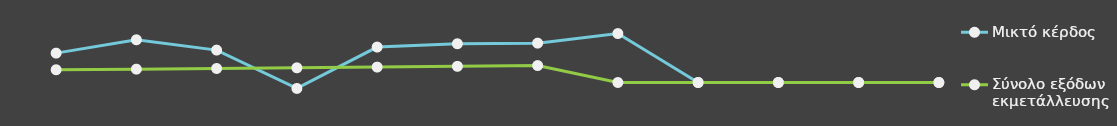
| Category | Μικτό κέρδος | Σύνολο εξόδων εκμετάλλευσης |
|---|---|---|
| 0 | 25000 | 10841 |
| 1 | 36348 | 11367.25 |
| 2 | 27562 | 11919.82 |
| 3 | -5059.5 | 12500.01 |
| 4 | 30153.18 | 13109.21 |
| 5 | 32964.45 | 13748.86 |
| 6 | 33502.87 | 14420.51 |
| 7 | 41646 | 0 |
| 8 | 0 | 0 |
| 9 | 0 | 0 |
| 10 | 0 | 0 |
| 11 | 0 | 0 |